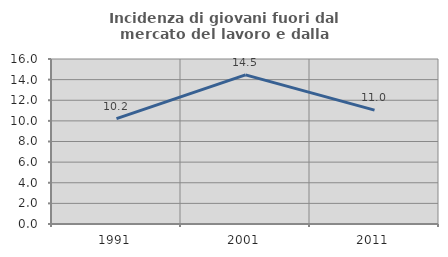
| Category | Incidenza di giovani fuori dal mercato del lavoro e dalla formazione  |
|---|---|
| 1991.0 | 10.222 |
| 2001.0 | 14.458 |
| 2011.0 | 11.043 |